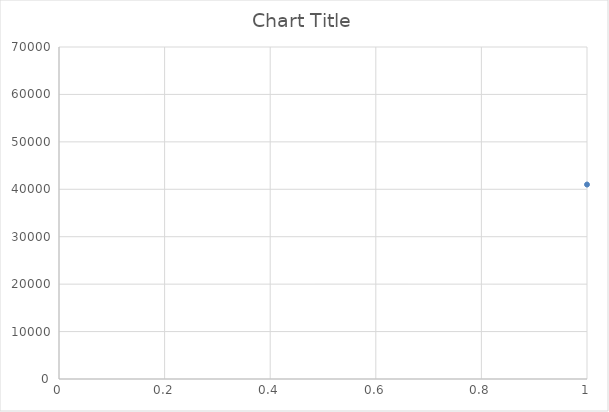
| Category | Series 0 |
|---|---|
| 0 | 41000 |
| 1 | 41500 |
| 2 | 41000 |
| 3 | 50500 |
| 4 | 31800 |
| 5 | 31400 |
| 6 | 31000 |
| 7 | 31800 |
| 8 | 42000 |
| 9 | 43500 |
| 10 | 31600 |
| 11 | 31600 |
| 12 | 31000 |
| 13 | 31600 |
| 14 | 31800 |
| 15 | 31400 |
| 16 | 31000 |
| 17 | 31800 |
| 18 | 42500 |
| 19 | 44500 |
| 20 | 42000 |
| 21 | 43500 |
| 22 | 9800 |
| 23 | 13000 |
| 24 | 19000 |
| 25 | 9000 |
| 26 | 12200 |
| 27 | 18000 |
| 28 | 24000 |
| 29 | 9800 |
| 30 | 9800 |
| 31 | 12000 |
| 32 | 18000 |
| 33 | 25000 |
| 34 | 23600 |
| 35 | 24000 |
| 36 | 23800 |
| 37 | 33400 |
| 38 | 35404 |
| 39 | 35738 |
| 40 | 33400 |
| 41 | 45500 |
| 42 | 46500 |
| 43 | 55500 |
| 44 | 19000 |
| 45 | 19000 |
| 46 | 48000 |
| 47 | 48000 |
| 48 | 23000 |
| 49 | 23000 |
| 50 | 28000 |
| 51 | 36000 |
| 52 | 36000 |
| 53 | 23600 |
| 54 | 24000 |
| 55 | 23800 |
| 56 | 33400 |
| 57 | 35404 |
| 58 | 35738 |
| 59 | 33400 |
| 60 | 45500 |
| 61 | 46500 |
| 62 | 55500 |
| 63 | 55500 |
| 64 | 33400 |
| 65 | 45500 |
| 66 | 23600 |
| 67 | 18000 |
| 68 | 18000 |
| 69 | 24000 |
| 70 | 11800 |
| 71 | 10900 |
| 72 | 18000 |
| 73 | 18000 |
| 74 | 19000 |
| 75 | 24000 |
| 76 | 28000 |
| 77 | 9000 |
| 78 | 13000 |
| 79 | 19000 |
| 80 | 10900 |
| 81 | 11800 |
| 82 | 24000 |
| 83 | 18000 |
| 84 | 18900 |
| 85 | 24000 |
| 86 | 18940 |
| 87 | 24000 |
| 88 | 23600 |
| 89 | 35000 |
| 90 | 45500 |
| 91 | 50000 |
| 92 | 12000 |
| 93 | 16000 |
| 94 | 18000 |
| 95 | 12000 |
| 96 | 14400 |
| 97 | 18000 |
| 98 | 21600 |
| 99 | 25400 |
| 100 | 18295 |
| 101 | 18056 |
| 102 | 13679 |
| 103 | 10089 |
| 104 | 10942 |
| 105 | 10000 |
| 106 | 13500 |
| 107 | 16200 |
| 108 | 21600 |
| 109 | 11000 |
| 110 | 13000 |
| 111 | 8806.37 |
| 112 | 10900 |
| 113 | 11800 |
| 114 | 24000 |
| 115 | 24000 |
| 116 | 23250 |
| 117 | 10800 |
| 118 | 13300 |
| 119 | 27000 |
| 120 | 13600 |
| 121 | 22000 |
| 122 | 25000 |
| 123 | 36400 |
| 124 | 54000 |
| 125 | 42000 |
| 126 | 12000 |
| 127 | 16000 |
| 128 | 12000 |
| 129 | 12000 |
| 130 | 16000 |
| 131 | 16000 |
| 132 | 12000 |
| 133 | 16000 |
| 134 | 18000 |
| 135 | 12000 |
| 136 | 16000 |
| 137 | 18000 |
| 138 | 16000 |
| 139 | 18000 |
| 140 | 16000 |
| 141 | 18000 |
| 142 | 12000 |
| 143 | 12000 |
| 144 | 12000 |
| 145 | 12000 |
| 146 | 16000 |
| 147 | 16000 |
| 148 | 18000 |
| 149 | 18000 |
| 150 | 21600 |
| 151 | 21600 |
| 152 | 21850 |
| 153 | 22600 |
| 154 | 12000 |
| 155 | 16000 |
| 156 | 18000 |
| 157 | 21850 |
| 158 | 12000 |
| 159 | 10000 |
| 160 | 24400 |
| 161 | 19000 |
| 162 | 28000 |
| 163 | 48000 |
| 164 | 28000 |
| 165 | 36000 |
| 166 | 10000 |
| 167 | 12000 |
| 168 | 25000 |
| 169 | 12000 |
| 170 | 24000 |
| 171 | 11800 |
| 172 | 10900 |
| 173 | 10900 |
| 174 | 11800 |
| 175 | 24000 |
| 176 | 9800 |
| 177 | 18000 |
| 178 | 25000 |
| 179 | 10900 |
| 180 | 12000 |
| 181 | 24000 |
| 182 | 10000 |
| 183 | 12000 |
| 184 | 25000 |
| 185 | 12000 |
| 186 | 11000 |
| 187 | 12000 |
| 188 | 9800 |
| 189 | 9800 |
| 190 | 12000 |
| 191 | 12000 |
| 192 | 18000 |
| 193 | 18000 |
| 194 | 25000 |
| 195 | 25000 |
| 196 | 18000 |
| 197 | 24000 |
| 198 | 24000 |
| 199 | 10000 |
| 200 | 10000 |
| 201 | 12000 |
| 202 | 12000 |
| 203 | 18000 |
| 204 | 18000 |
| 205 | 24400 |
| 206 | 24400 |
| 207 | 10000 |
| 208 | 12000 |
| 209 | 18000 |
| 210 | 10900 |
| 211 | 9800 |
| 212 | 11800 |
| 213 | 12000 |
| 214 | 18000 |
| 215 | 24000 |
| 216 | 25000 |
| 217 | 24400 |
| 218 | 9800 |
| 219 | 18000 |
| 220 | 25000 |
| 221 | 18000 |
| 222 | 24000 |
| 223 | 9000 |
| 224 | 12200 |
| 225 | 18000 |
| 226 | 24000 |
| 227 | 29000 |
| 228 | 30000 |
| 229 | 42500 |
| 230 | 9000 |
| 231 | 18000 |
| 232 | 24000 |
| 233 | 12200 |
| 234 | 29000 |
| 235 | 30000 |
| 236 | 42500 |
| 237 | 9000 |
| 238 | 13000 |
| 239 | 19000 |
| 240 | 18000 |
| 241 | 24000 |
| 242 | 9000 |
| 243 | 12200 |
| 244 | 9000 |
| 245 | 12600 |
| 246 | 16000 |
| 247 | 22000 |
| 248 | 27700 |
| 249 | 10000 |
| 250 | 12000 |
| 251 | 16500 |
| 252 | 20400 |
| 253 | 9000 |
| 254 | 9000 |
| 255 | 9000 |
| 256 | 9000 |
| 257 | 9000 |
| 258 | 9000 |
| 259 | 9000 |
| 260 | 13000 |
| 261 | 13000 |
| 262 | 13000 |
| 263 | 13000 |
| 264 | 13000 |
| 265 | 13000 |
| 266 | 13000 |
| 267 | 19000 |
| 268 | 19000 |
| 269 | 19000 |
| 270 | 19000 |
| 271 | 19000 |
| 272 | 19000 |
| 273 | 19000 |
| 274 | 33200 |
| 275 | 33000 |
| 276 | 28000 |
| 277 | 36000 |
| 278 | 10900 |
| 279 | 12000 |
| 280 | 24000 |
| 281 | 10900 |
| 282 | 12000 |
| 283 | 12000 |
| 284 | 24000 |
| 285 | 13600 |
| 286 | 22000 |
| 287 | 27000 |
| 288 | 24000 |
| 289 | 36000 |
| 290 | 23250 |
| 291 | 32000 |
| 292 | 54000 |
| 293 | 20000 |
| 294 | 27600 |
| 295 | 27000 |
| 296 | 10800 |
| 297 | 10800 |
| 298 | 13300 |
| 299 | 13300 |
| 300 | 12000 |
| 301 | 11000 |
| 302 | 22000 |
| 303 | 18000 |
| 304 | 45000 |
| 305 | 22000 |
| 306 | 26000 |
| 307 | 28600 |
| 308 | 40000 |
| 309 | 41000 |
| 310 | 41000 |
| 311 | 45000 |
| 312 | 45000 |
| 313 | 27000 |
| 314 | 40000 |
| 315 | 48000 |
| 316 | 45000 |
| 317 | 45000 |
| 318 | 22000 |
| 319 | 42000 |
| 320 | 54000 |
| 321 | 66000 |
| 322 | 42000 |
| 323 | 66000 |
| 324 | 28600 |
| 325 | 25000 |
| 326 | 42000 |
| 327 | 28600 |
| 328 | 25000 |
| 329 | 13600 |
| 330 | 21600 |
| 331 | 38000 |
| 332 | 38000 |
| 333 | 38000 |
| 334 | 27600 |
| 335 | 10900 |
| 336 | 13600 |
| 337 | 10900 |
| 338 | 13600 |
| 339 | 18000 |
| 340 | 13600 |
| 341 | 10900 |
| 342 | 18540 |
| 343 | 10900 |
| 344 | 13600 |
| 345 | 10900 |
| 346 | 14400 |
| 347 | 18000 |
| 348 | 21600 |
| 349 | 26000 |
| 350 | 38000 |
| 351 | 20300 |
| 352 | 18000 |
| 353 | 8700 |
| 354 | 8700 |
| 355 | 20300 |
| 356 | 13000 |
| 357 | 11000 |
| 358 | 21000 |
| 359 | 21600 |
| 360 | 22400 |
| 361 | 34400 |
| 362 | 22400 |
| 363 | 34400 |
| 364 | 26000 |
| 365 | 12000 |
| 366 | 13800 |
| 367 | 21600 |
| 368 | 10900 |
| 369 | 13600 |
| 370 | 9000 |
| 371 | 11500 |
| 372 | 18000 |
| 373 | 28600 |
| 374 | 25000 |
| 375 | 22000 |
| 376 | 12000 |
| 377 | 32000 |
| 378 | 40000 |
| 379 | 12000 |
| 380 | 32000 |
| 381 | 40000 |
| 382 | 12600 |
| 383 | 13600 |
| 384 | 27000 |
| 385 | 12000 |
| 386 | 14000 |
| 387 | 11000 |
| 388 | 10800 |
| 389 | 18000 |
| 390 | 20200 |
| 391 | 20200 |
| 392 | 42500 |
| 393 | 32200 |
| 394 | 41000 |
| 395 | 20000 |
| 396 | 41500 |
| 397 | 32000 |
| 398 | 31800 |
| 399 | 31200 |
| 400 | 32600 |
| 401 | 32000 |
| 402 | 32000 |
| 403 | 31800 |
| 404 | 31200 |
| 405 | 32600 |
| 406 | 31600 |
| 407 | 31000 |
| 408 | 30400 |
| 409 | 30800 |
| 410 | 31800 |
| 411 | 43000 |
| 412 | 33800 |
| 413 | 32800 |
| 414 | 33200 |
| 415 | 33000 |
| 416 | 32800 |
| 417 | 33200 |
| 418 | 43500 |
| 419 | 20200 |